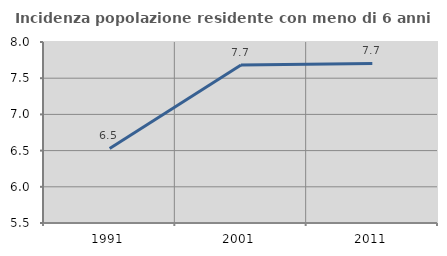
| Category | Incidenza popolazione residente con meno di 6 anni |
|---|---|
| 1991.0 | 6.53 |
| 2001.0 | 7.681 |
| 2011.0 | 7.704 |